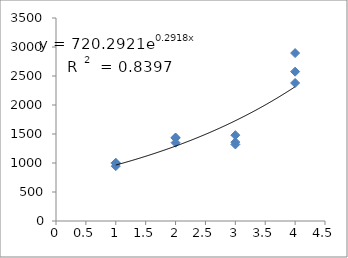
| Category | Series 0 |
|---|---|
| 1.0 | 946 |
| 1.0 | 994 |
| 1.0 | 1004 |
| 2.0 | 1430 |
| 2.0 | 1350 |
| 2.0 | 1440 |
| 3.0 | 1360 |
| 3.0 | 1480 |
| 3.0 | 1320 |
| 4.0 | 2575 |
| 4.0 | 2895 |
| 4.0 | 2380 |